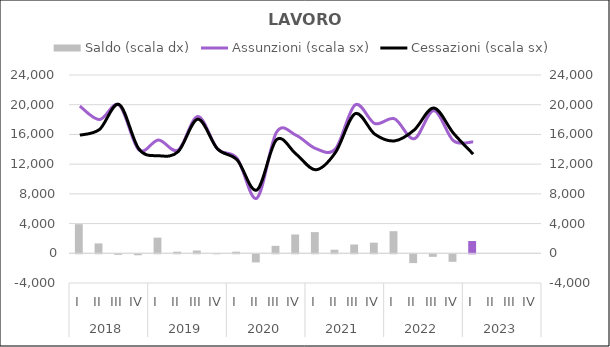
| Category | Saldo (scala dx) |
|---|---|
| 0 | 3920 |
| 1 | 1330 |
| 2 | -75 |
| 3 | -130 |
| 4 | 2110 |
| 5 | 215 |
| 6 | 370 |
| 7 | 5 |
| 8 | 215 |
| 9 | -1095 |
| 10 | 1005 |
| 11 | 2535 |
| 12 | 2850 |
| 13 | 480 |
| 14 | 1185 |
| 15 | 1430 |
| 16 | 2975 |
| 17 | -1185 |
| 18 | -345 |
| 19 | -1015 |
| 20 | 1650 |
| 21 | 0 |
| 22 | 0 |
| 23 | 0 |